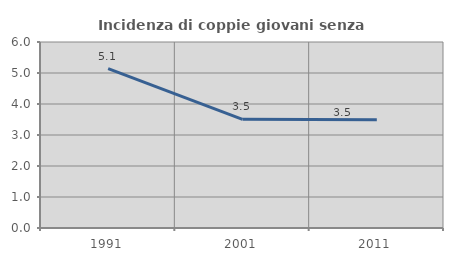
| Category | Incidenza di coppie giovani senza figli |
|---|---|
| 1991.0 | 5.144 |
| 2001.0 | 3.507 |
| 2011.0 | 3.488 |